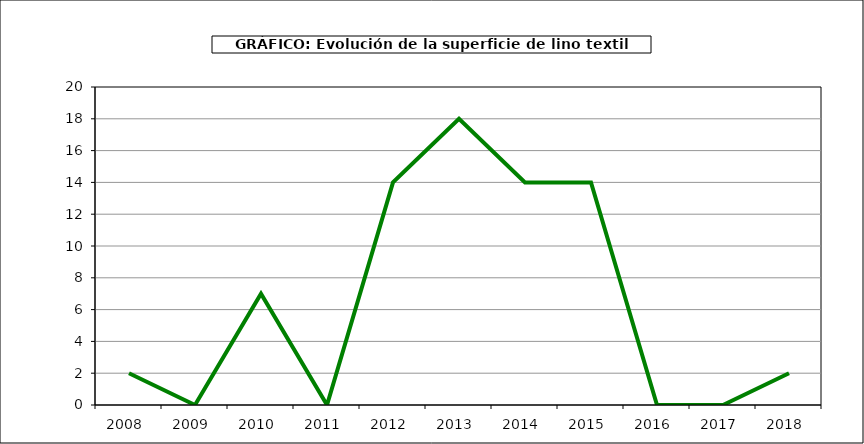
| Category | Superficie |
|---|---|
| 2008.0 | 2 |
| 2009.0 | 0 |
| 2010.0 | 7 |
| 2011.0 | 0 |
| 2012.0 | 14 |
| 2013.0 | 18 |
| 2014.0 | 14 |
| 2015.0 | 14 |
| 2016.0 | 0 |
| 2017.0 | 0 |
| 2018.0 | 2 |